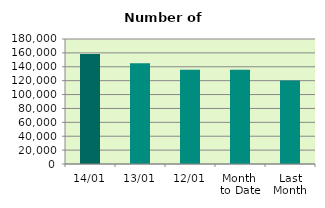
| Category | Series 0 |
|---|---|
| 14/01 | 158556 |
| 13/01 | 145056 |
| 12/01 | 135760 |
| Month 
to Date | 135700 |
| Last
Month | 120108.783 |